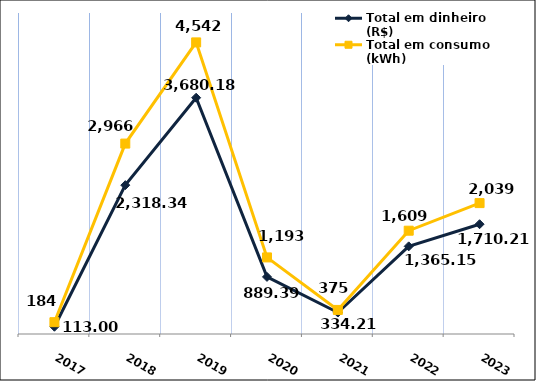
| Category | Total em dinheiro (R$) |
|---|---|
| 2017.0 | 113 |
| 2018.0 | 2318.34 |
| 2019.0 | 3680.18 |
| 2020.0 | 889.39 |
| 2021.0 | 334.21 |
| 2022.0 | 1365.15 |
| 2023.0 | 1710.21 |